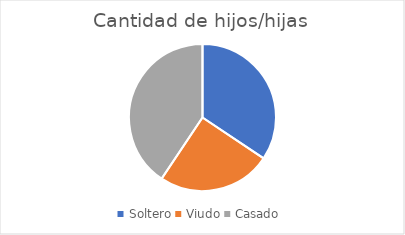
| Category | Cantidad de hijos/hijas |
|---|---|
| Soltero | 11 |
| Viudo | 8 |
| Casado | 13 |